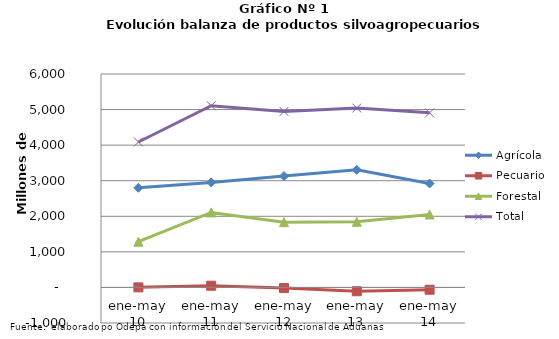
| Category | Agrícola | Pecuario | Forestal | Total |
|---|---|---|---|---|
| ene-may 10 | 2801143 | 1618 | 1285521 | 4088282 |
| ene-may 11 | 2951769 | 48301 | 2108708 | 5108778 |
| ene-may 12 | 3129827 | -18183 | 1834697 | 4946341 |
| ene-may 13 | 3305497 | -107038 | 1844427 | 5042886 |
| ene-may 14 | 2921095 | -64536 | 2051041 | 4907600 |